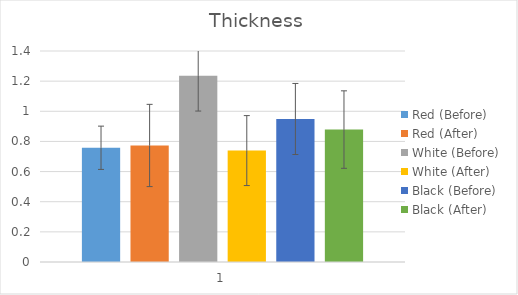
| Category | Red (Before) | Red (After) | White (Before) | White (After) | Black (Before) | Black (After) |
|---|---|---|---|---|---|---|
| 0 | 0.758 | 0.773 | 1.235 | 0.739 | 0.949 | 0.879 |